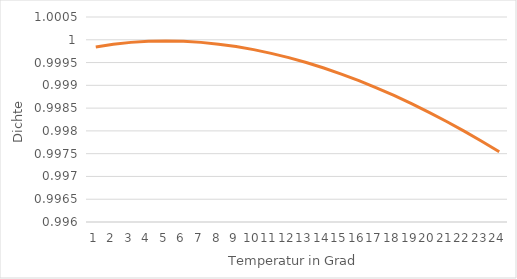
| Category | Series 1 |
|---|---|
| 0 | 1 |
| 1 | 1 |
| 2 | 1 |
| 3 | 1 |
| 4 | 1 |
| 5 | 1 |
| 6 | 1 |
| 7 | 1 |
| 8 | 1 |
| 9 | 1 |
| 10 | 1 |
| 11 | 1 |
| 12 | 1 |
| 13 | 0.999 |
| 14 | 0.999 |
| 15 | 0.999 |
| 16 | 0.999 |
| 17 | 0.999 |
| 18 | 0.999 |
| 19 | 0.998 |
| 20 | 0.998 |
| 21 | 0.998 |
| 22 | 0.998 |
| 23 | 0.998 |